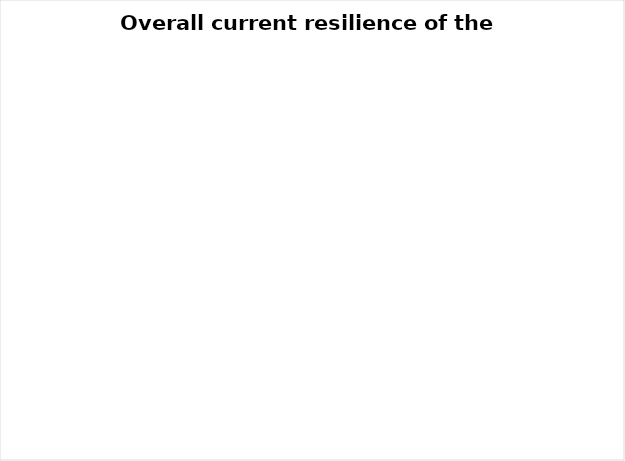
| Category | Series 0 |
|---|---|
| Vulnerable | 0 |
| Of concern | 0 |
| Resilient | 0 |
| Don't know | 0 |